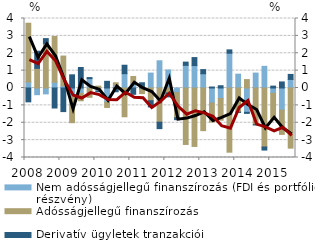
| Category | Nem adósságjellegű finanszírozás (FDI és portfólió részvény) | Adósságjellegű finanszírozás | Derivatív ügyletek tranzakciói |
|---|---|---|---|
| 2008.0 | 0.348 | 3.381 | -0.797 |
| 2008.0 | -0.385 | 1.131 | 0.986 |
| 2008.0 | -0.338 | 2.551 | 0.292 |
| 2008.0 | 0.334 | 2.628 | -1.152 |
| 2009.0 | 0.125 | 1.714 | -1.358 |
| 2009.0 | -0.495 | -1.502 | 0.758 |
| 2009.0 | -0.31 | -0.426 | 1.181 |
| 2009.0 | 0.54 | -0.537 | 0.06 |
| 2010.0 | -0.188 | 0.108 | -0.028 |
| 2010.0 | -0.819 | -0.301 | 0.384 |
| 2010.0 | 0.167 | 0.134 | -0.216 |
| 2010.0 | 0.825 | -1.656 | 0.485 |
| 2011.0 | 0.28 | 0.384 | -0.362 |
| 2011.0 | -0.045 | -0.279 | 0.301 |
| 2011.0 | 0.858 | -0.734 | -0.355 |
| 2011.0 | 1.566 | -1.967 | -0.372 |
| 2012.0 | 1.038 | -0.282 | -0.228 |
| 2012.0 | -0.271 | -1.439 | -0.112 |
| 2012.0 | 1.304 | -3.249 | 0.185 |
| 2012.0 | 1.29 | -3.363 | 0.461 |
| 2013.0 | 0.82 | -2.455 | 0.238 |
| 2013.0 | -0.86 | -1.101 | 0.057 |
| 2013.0 | -0.609 | -1.243 | 0.129 |
| 2013.0 | 2.001 | -3.695 | 0.193 |
| 2014.0 | 0.796 | -1.39 | -0.015 |
| 2014.0 | -1.399 | 0.484 | -0.062 |
| 2014.0 | 0.858 | -2.112 | -0.012 |
| 2014.0 | 1.246 | -3.396 | -0.175 |
| 2015.0 | -0.301 | -1.521 | 0.108 |
| 2015.0 | -1.277 | -1.393 | 0.349 |
| 2015.0 | 0.493 | -3.461 | 0.288 |